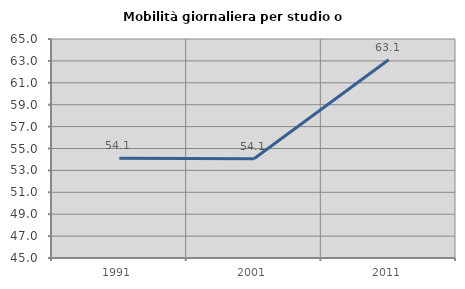
| Category | Mobilità giornaliera per studio o lavoro |
|---|---|
| 1991.0 | 54.118 |
| 2001.0 | 54.065 |
| 2011.0 | 63.109 |